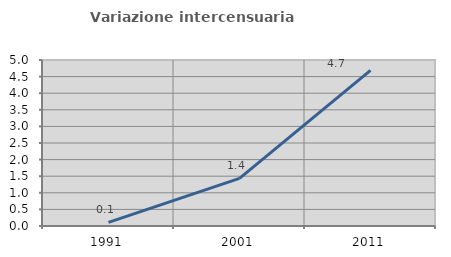
| Category | Variazione intercensuaria annua |
|---|---|
| 1991.0 | 0.108 |
| 2001.0 | 1.436 |
| 2011.0 | 4.688 |